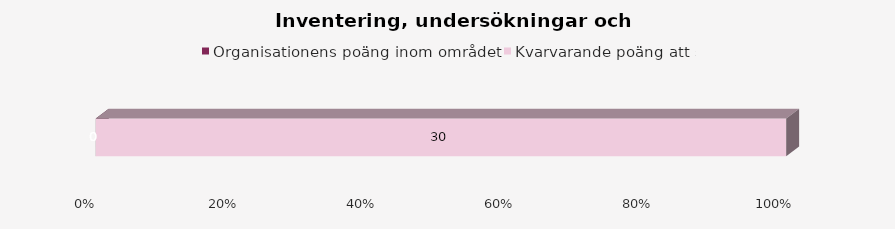
| Category | Organisationens poäng inom området | Kvarvarande poäng att samla |
|---|---|---|
| 0 | 0 | 30 |